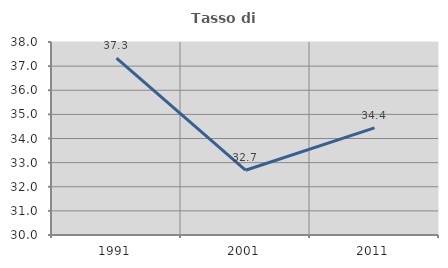
| Category | Tasso di occupazione   |
|---|---|
| 1991.0 | 37.329 |
| 2001.0 | 32.685 |
| 2011.0 | 34.443 |